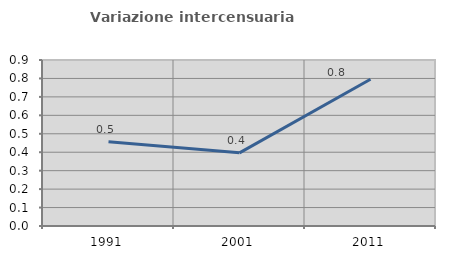
| Category | Variazione intercensuaria annua |
|---|---|
| 1991.0 | 0.457 |
| 2001.0 | 0.397 |
| 2011.0 | 0.796 |